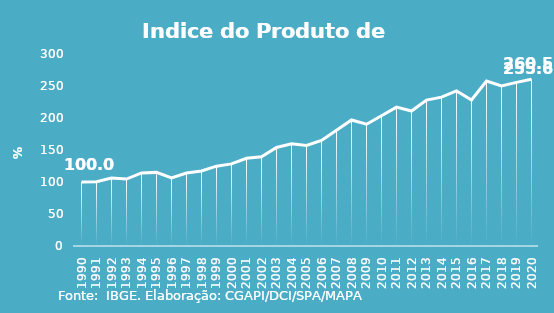
| Category | Indice de Prod. base 1990 |
|---|---|
| 1990.0 | 100 |
| 1991.0 | 100.275 |
| 1992.0 | 106.203 |
| 1993.0 | 104.57 |
| 1994.0 | 114.164 |
| 1995.0 | 115.024 |
| 1996.0 | 106.552 |
| 1997.0 | 114.037 |
| 1998.0 | 117.319 |
| 1999.0 | 124.734 |
| 2000.0 | 128.293 |
| 2001.0 | 136.975 |
| 2002.0 | 139.51 |
| 2003.0 | 153.868 |
| 2004.0 | 159.641 |
| 2005.0 | 157.136 |
| 2006.0 | 164.858 |
| 2007.0 | 180.781 |
| 2008.0 | 196.91 |
| 2009.0 | 190.309 |
| 2010.0 | 203.581 |
| 2011.0 | 217.041 |
| 2012.0 | 210.932 |
| 2013.0 | 228.009 |
| 2014.0 | 232.562 |
| 2015.0 | 242.318 |
| 2016.0 | 228.239 |
| 2017.0 | 257.766 |
| 2018.0 | 250.124 |
| 2019.0 | 255.64 |
| 2020.0 | 260.533 |